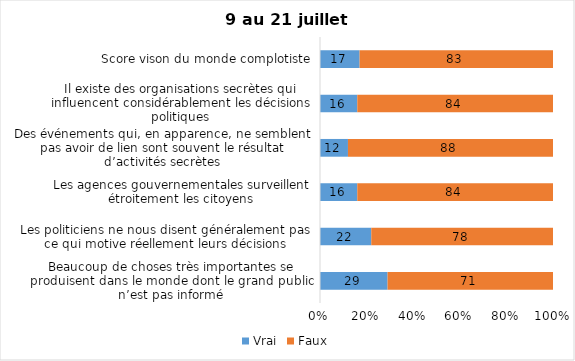
| Category | Vrai | Faux |
|---|---|---|
| Beaucoup de choses très importantes se produisent dans le monde dont le grand public n’est pas informé | 29 | 71 |
| Les politiciens ne nous disent généralement pas ce qui motive réellement leurs décisions | 22 | 78 |
| Les agences gouvernementales surveillent étroitement les citoyens | 16 | 84 |
| Des événements qui, en apparence, ne semblent pas avoir de lien sont souvent le résultat d’activités secrètes | 12 | 88 |
| Il existe des organisations secrètes qui influencent considérablement les décisions politiques | 16 | 84 |
| Score vison du monde complotiste | 17 | 83 |